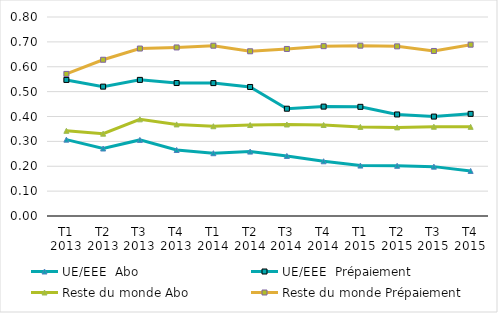
| Category | UE/EEE  | Reste du monde |
|---|---|---|
| T1 2013 | 0.547 | 0.571 |
| T2 2013 | 0.52 | 0.628 |
| T3 2013 | 0.547 | 0.673 |
| T4 2013 | 0.535 | 0.678 |
| T1 2014 | 0.534 | 0.685 |
| T2 2014 | 0.519 | 0.662 |
| T3 2014 | 0.431 | 0.672 |
| T4 2014 | 0.44 | 0.683 |
| T1 2015 | 0.439 | 0.685 |
| T2 2015 | 0.408 | 0.682 |
| T3 2015 | 0.4 | 0.663 |
| T4 2015 | 0.411 | 0.689 |